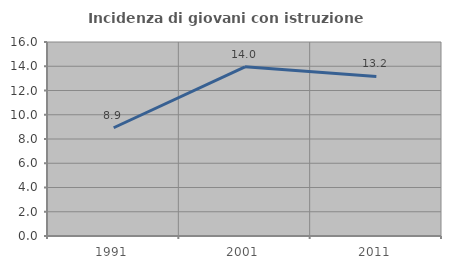
| Category | Incidenza di giovani con istruzione universitaria |
|---|---|
| 1991.0 | 8.929 |
| 2001.0 | 13.953 |
| 2011.0 | 13.158 |